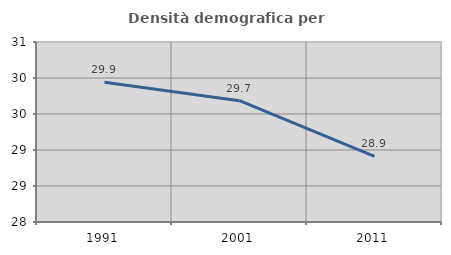
| Category | Densità demografica |
|---|---|
| 1991.0 | 29.942 |
| 2001.0 | 29.685 |
| 2011.0 | 28.913 |